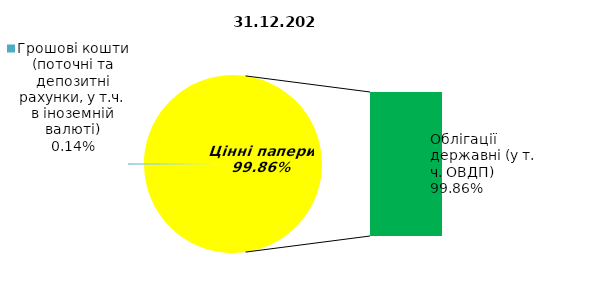
| Category | Series 0 |
|---|---|
| Грошові кошти (поточні та депозитні рахунки, у т.ч. в іноземній валюті) | 0.261 |
| Банківські метали | 0 |
| Нерухомість | 0 |
| Інші активи | 0 |
| Акції | 0 |
| Корпоративні облігації  | 0 |
| Облігації місцевих позик | 0 |
| Облігації державні (у т. ч. ОВДП) | 191.218 |
| Іпотечні сертифікати | 0 |